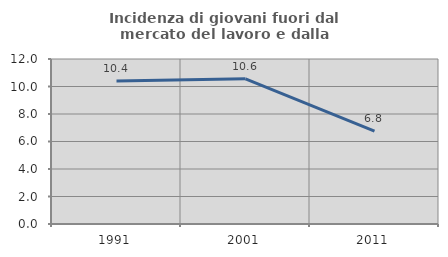
| Category | Incidenza di giovani fuori dal mercato del lavoro e dalla formazione  |
|---|---|
| 1991.0 | 10.403 |
| 2001.0 | 10.556 |
| 2011.0 | 6.753 |